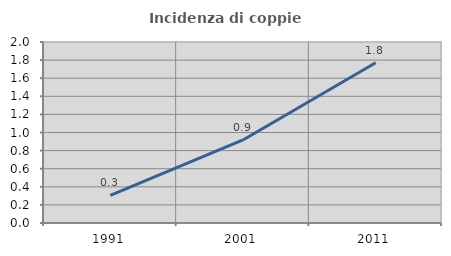
| Category | Incidenza di coppie miste |
|---|---|
| 1991.0 | 0.306 |
| 2001.0 | 0.917 |
| 2011.0 | 1.77 |